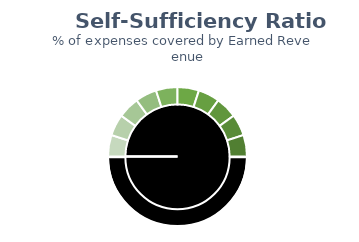
| Category | Pointer |
|---|---|
| 0 | 0 |
| 1 | 0.025 |
| 2 | 0 |